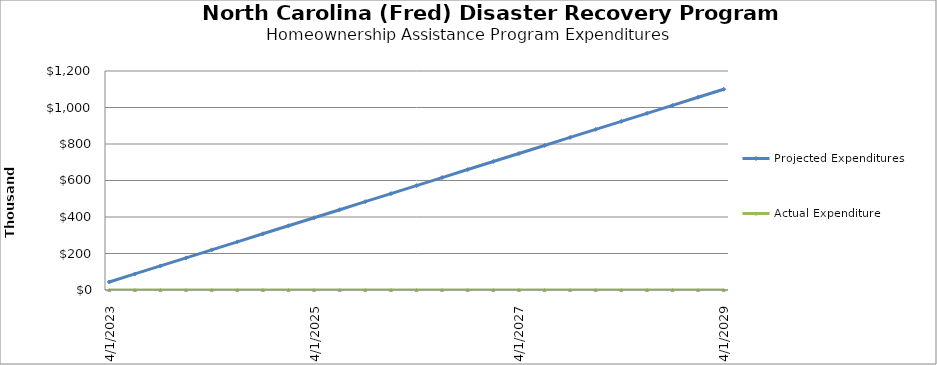
| Category | Projected Expenditures | Actual Expenditure |
|---|---|---|
| 4/1/23 | 44000 | 0 |
| 7/1/23 | 88000 | 0 |
| 10/1/23 | 132000 | 0 |
| 1/1/24 | 176000 | 0 |
| 4/1/24 | 220000 | 0 |
| 7/1/24 | 264000 | 0 |
| 10/1/24 | 308000 | 0 |
| 1/1/25 | 352000 | 0 |
| 4/1/25 | 396000 | 0 |
| 7/1/25 | 440000 | 0 |
| 10/1/25 | 484000 | 0 |
| 1/1/26 | 528000 | 0 |
| 4/1/26 | 572000 | 0 |
| 7/1/26 | 616000 | 0 |
| 10/1/26 | 660000 | 0 |
| 1/1/27 | 704000 | 0 |
| 4/1/27 | 748000 | 0 |
| 7/1/27 | 792000 | 0 |
| 10/1/27 | 836000 | 0 |
| 1/1/28 | 880000 | 0 |
| 4/1/28 | 924000 | 0 |
| 7/1/28 | 968000 | 0 |
| 10/1/28 | 1012000 | 0 |
| 1/1/29 | 1056000 | 0 |
| 4/1/29 | 1100000 | 0 |